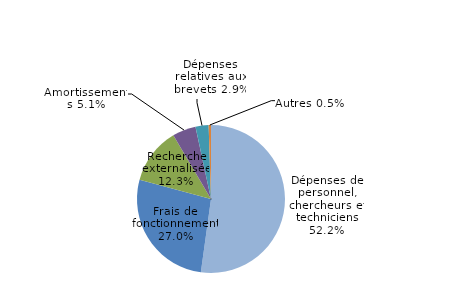
| Category | Series 0 |
|---|---|
| Dépenses de personnel, chercheurs et techniciens | 0.522 |
| Frais de fonctionnement | 0.27 |
| Recherche externalisée | 0.123 |
| Amortissements | 0.051 |
| Dépenses relatives aux brevets | 0.029 |
| Autres | 0.005 |